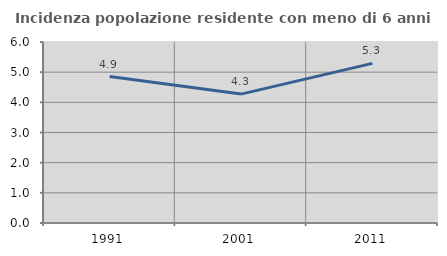
| Category | Incidenza popolazione residente con meno di 6 anni |
|---|---|
| 1991.0 | 4.854 |
| 2001.0 | 4.273 |
| 2011.0 | 5.291 |